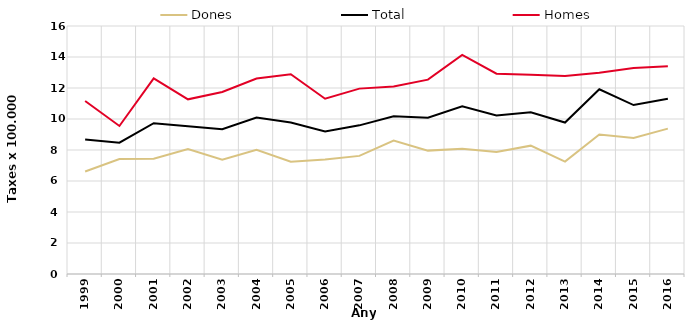
| Category | Dones | Total | Homes |
|---|---|---|---|
| 1999.0 | 6.61 | 8.68 | 11.16 |
| 2000.0 | 7.42 | 8.47 | 9.55 |
| 2001.0 | 7.43 | 9.73 | 12.62 |
| 2002.0 | 8.06 | 9.54 | 11.27 |
| 2003.0 | 7.38 | 9.34 | 11.74 |
| 2004.0 | 8.01 | 10.1 | 12.61 |
| 2005.0 | 7.25 | 9.78 | 12.89 |
| 2006.0 | 7.38 | 9.2 | 11.31 |
| 2007.0 | 7.62 | 9.59 | 11.96 |
| 2008.0 | 8.61 | 10.18 | 12.1 |
| 2009.0 | 7.96 | 10.08 | 12.54 |
| 2010.0 | 8.08 | 10.82 | 14.14 |
| 2011.0 | 7.87 | 10.22 | 12.92 |
| 2012.0 | 8.28 | 10.43 | 12.85 |
| 2013.0 | 7.25 | 9.77 | 12.77 |
| 2014.0 | 9 | 11.92 | 12.98 |
| 2015.0 | 8.78 | 10.9 | 13.29 |
| 2016.0 | 9.38 | 11.3 | 13.4 |